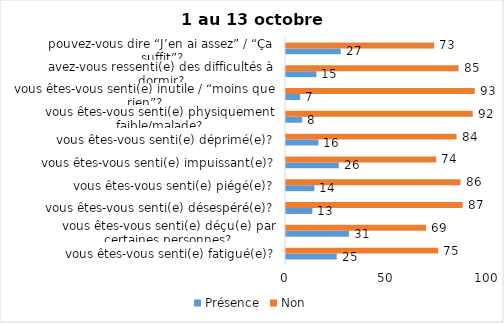
| Category | Présence | Non |
|---|---|---|
| vous êtes-vous senti(e) fatigué(e)? | 25 | 75 |
| vous êtes-vous senti(e) déçu(e) par certaines personnes? | 31 | 69 |
| vous êtes-vous senti(e) désespéré(e)? | 13 | 87 |
| vous êtes-vous senti(e) piégé(e)? | 14 | 86 |
| vous êtes-vous senti(e) impuissant(e)? | 26 | 74 |
| vous êtes-vous senti(e) déprimé(e)? | 16 | 84 |
| vous êtes-vous senti(e) physiquement faible/malade? | 8 | 92 |
| vous êtes-vous senti(e) inutile / “moins que rien”? | 7 | 93 |
| avez-vous ressenti(e) des difficultés à dormir? | 15 | 85 |
| pouvez-vous dire “J’en ai assez” / “Ça suffit”? | 27 | 73 |